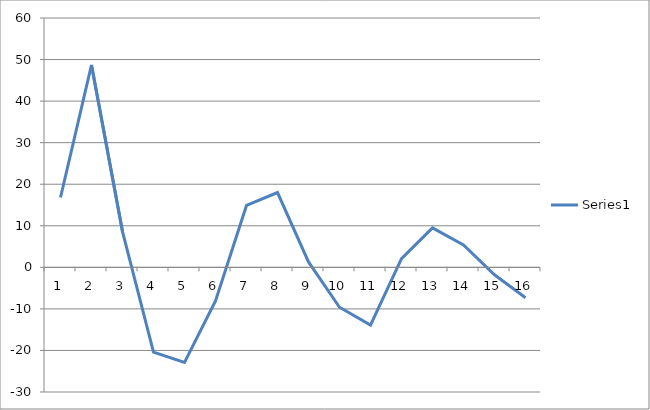
| Category | Series 0 |
|---|---|
| 0 | 16.8 |
| 1 | 48.7 |
| 2 | 8.6 |
| 3 | -20.4 |
| 4 | -22.9 |
| 5 | -8.1 |
| 6 | 14.9 |
| 7 | 18 |
| 8 | 1.3 |
| 9 | -9.6 |
| 10 | -13.9 |
| 11 | 2.1 |
| 12 | 9.5 |
| 13 | 5.4 |
| 14 | -1.8 |
| 15 | -7.3 |